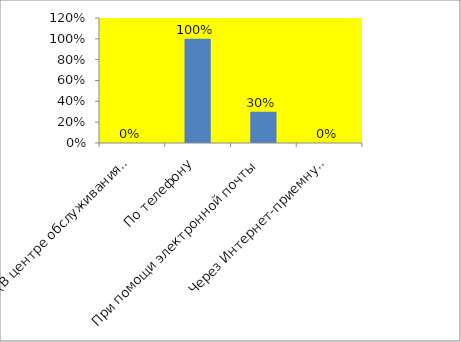
| Category | Series 0 |
|---|---|
| Лично (В центре обслуживания клиентов) | 0 |
| По телефону | 1 |
| При помощи электронной почты | 0.3 |
|            Через Интернет-приемную | 0 |